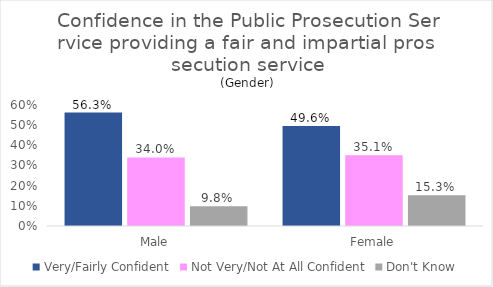
| Category | Very/Fairly Confident | Not Very/Not At All Confident | Don't Know |
|---|---|---|---|
| Male | 0.563 | 0.34 | 0.098 |
| Female | 0.496 | 0.351 | 0.153 |